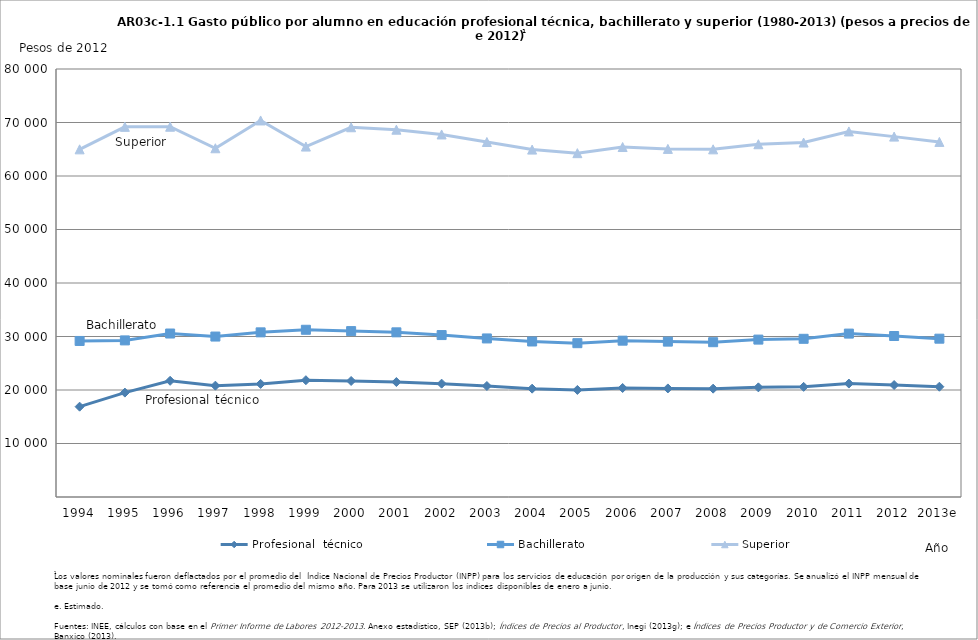
| Category | Profesional  técnico | Bachillerato | Superior |
|---|---|---|---|
| 1994 | 16885 | 29165 | 64981 |
| 1995 | 19514 | 29271 | 69186 |
| 1996 | 21720 | 30556 | 69211 |
| 1997 | 20810 | 29991 | 65186 |
| 1998 | 21141 | 30774 | 70380 |
| 1999 | 21834 | 31257 | 65501 |
| 2000 | 21686 | 31009 | 69112 |
| 2001 | 21489 | 30777 | 68656 |
| 2002 | 21187 | 30267 | 67764 |
| 2003 | 20746 | 29637 | 66354 |
| 2004 | 20253 | 29066 | 64934 |
| 2005 | 20014 | 28752 | 64269 |
| 2006 | 20376 | 29223 | 65416 |
| 2007 | 20293 | 29044 | 65065 |
| 2008 | 20254 | 28934 | 64981 |
| 2009 | 20491 | 29420 | 65937 |
| 2010 | 20588 | 29568 | 66255 |
| 2011 | 21201 | 30543 | 68327 |
| 2012 | 20926 | 30093 | 67360 |
| 2013e | 20611 | 29593 | 66371 |